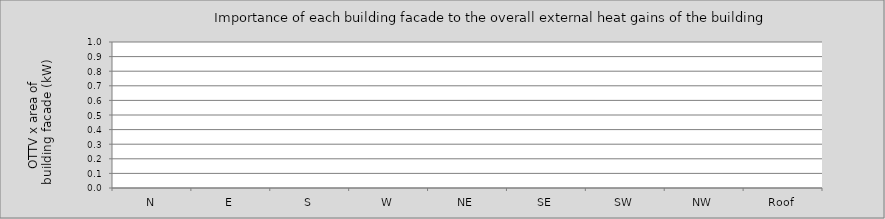
| Category | 4-Heat conduction through glazing due to air temp. difference | 3-Solar radiation through glazing | 2-Heat conduction through opaque elements due to air temp. difference | 1-Heat conduction through opaque elements due to absorption of solar rad. by element's surface |
|---|---|---|---|---|
| N | 0 | 0 | 0 | 0 |
| E | 0 | 0 | 0 | 0 |
| S | 0 | 0 | 0 | 0 |
| W | 0 | 0 | 0 | 0 |
| NE | 0 | 0 | 0 | 0 |
| SE | 0 | 0 | 0 | 0 |
| SW | 0 | 0 | 0 | 0 |
| NW | 0 | 0 | 0 | 0 |
| Roof | 0 | 0 | 0 | 0 |